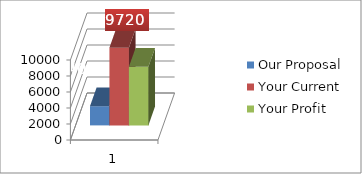
| Category | Our Proposal | Your Current | Your Profit |
|---|---|---|---|
| 0 | 2400 | 9720 | 7320 |